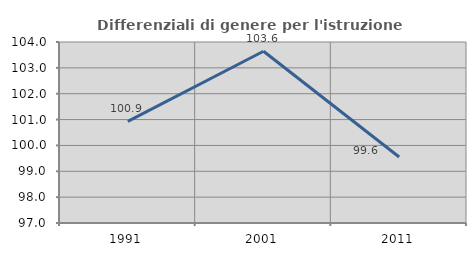
| Category | Differenziali di genere per l'istruzione superiore |
|---|---|
| 1991.0 | 100.928 |
| 2001.0 | 103.643 |
| 2011.0 | 99.551 |